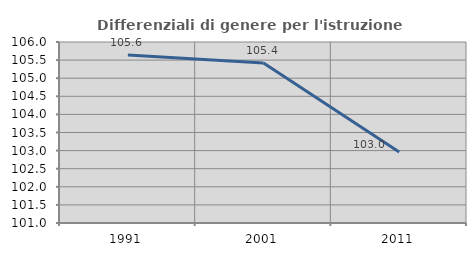
| Category | Differenziali di genere per l'istruzione superiore |
|---|---|
| 1991.0 | 105.643 |
| 2001.0 | 105.417 |
| 2011.0 | 102.961 |